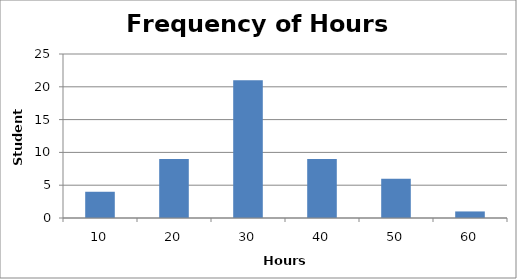
| Category | Series 0 |
|---|---|
| 10.0 | 4 |
| 20.0 | 9 |
| 30.0 | 21 |
| 40.0 | 9 |
| 50.0 | 6 |
| 60.0 | 1 |